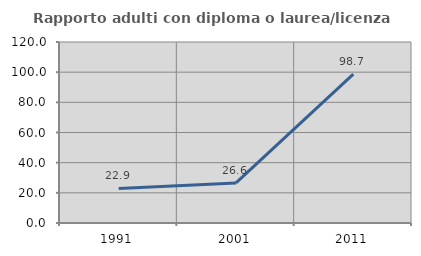
| Category | Rapporto adulti con diploma o laurea/licenza media  |
|---|---|
| 1991.0 | 22.917 |
| 2001.0 | 26.582 |
| 2011.0 | 98.684 |